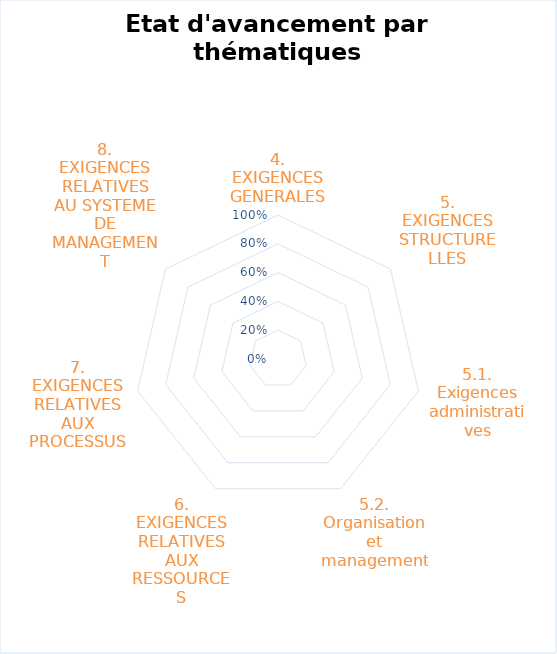
| Category | Series 0 |
|---|---|
| 4. EXIGENCES GENERALES | 0 |
| 5. EXIGENCES STRUCTURELLES | 0 |
| 5.1. Exigences administratives | 0 |
| 5.2. Organisation et management | 0 |
| 6. EXIGENCES RELATIVES AUX RESSOURCES | 0 |
| 7. EXIGENCES RELATIVES AUX PROCESSUS | 0 |
| 8. EXIGENCES RELATIVES AU SYSTEME DE MANAGEMENT | 0 |